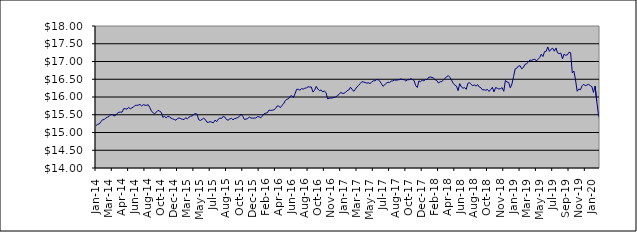
| Category | Series 0 |
|---|---|
| 2014-01-09 | 15.193 |
| 2014-01-17 | 15.231 |
| 2014-01-23 | 15.241 |
| 2014-01-31 | 15.301 |
| 2014-02-10 | 15.36 |
| 2014-02-14 | 15.362 |
| 2014-02-20 | 15.408 |
| 2014-02-28 | 15.432 |
| 2014-03-10 | 15.454 |
| 2014-03-14 | 15.502 |
| 2014-03-20 | 15.505 |
| 2014-03-26 | 15.466 |
| 2014-03-31 | 15.48 |
| 2014-04-09 | 15.541 |
| 2014-04-15 | 15.571 |
| 2014-04-24 | 15.573 |
| 2014-04-30 | 15.574 |
| 2014-05-08 | 15.673 |
| 2014-05-16 | 15.671 |
| 2014-05-22 | 15.656 |
| 2014-05-31 | 15.708 |
| 2014-06-09 | 15.667 |
| 2014-06-16 | 15.692 |
| 2014-06-20 | 15.717 |
| 2014-06-30 | 15.765 |
| 2014-07-09 | 15.765 |
| 2014-07-15 | 15.772 |
| 2014-07-22 | 15.79 |
| 2014-07-31 | 15.746 |
| 2014-08-11 | 15.785 |
| 2014-08-14 | 15.77 |
| 2014-08-21 | 15.765 |
| 2014-08-30 | 15.783 |
| 2014-09-08 | 15.703 |
| 2014-09-16 | 15.599 |
| 2014-09-23 | 15.56 |
| 2014-09-30 | 15.523 |
| 2014-10-09 | 15.576 |
| 2014-10-16 | 15.623 |
| 2014-10-23 | 15.601 |
| 2014-10-31 | 15.569 |
| 2014-11-10 | 15.429 |
| 2014-11-13 | 15.453 |
| 2014-11-20 | 15.416 |
| 2014-11-29 | 15.453 |
| 2014-12-10 | 15.441 |
| 2014-12-18 | 15.405 |
| 2014-12-23 | 15.384 |
| 2014-12-30 | 15.366 |
| 2015-01-08 | 15.346 |
| 2015-01-15 | 15.395 |
| 2015-01-30 | 15.412 |
| 2015-02-10 | 15.388 |
| 2015-02-16 | 15.373 |
| 2015-02-19 | 15.362 |
| 2015-02-28 | 15.417 |
| 2015-03-10 | 15.386 |
| 2015-03-13 | 15.43 |
| 2015-03-19 | 15.46 |
| 2015-03-27 | 15.467 |
| 2015-04-07 | 15.504 |
| 2015-04-16 | 15.55 |
| 2015-04-27 | 15.503 |
| 2015-05-08 | 15.359 |
| 2015-05-14 | 15.339 |
| 2015-05-21 | 15.37 |
| 2015-05-27 | 15.4 |
| 2015-06-03 | 15.368 |
| 2015-06-09 | 15.29 |
| 2015-06-15 | 15.288 |
| 2015-06-22 | 15.308 |
| 2015-06-26 | 15.289 |
| 2015-07-02 | 15.276 |
| 2015-07-09 | 15.349 |
| 2015-07-14 | 15.304 |
| 2015-07-23 | 15.379 |
| 2015-07-29 | 15.406 |
| 2015-08-06 | 15.396 |
| 2015-08-13 | 15.458 |
| 2015-08-20 | 15.434 |
| 2015-08-27 | 15.364 |
| 2015-09-03 | 15.348 |
| 2015-09-09 | 15.382 |
| 2015-09-15 | 15.398 |
| 2015-09-21 | 15.359 |
| 2015-09-28 | 15.39 |
| 2015-10-07 | 15.403 |
| 2015-10-13 | 15.423 |
| 2015-10-22 | 15.457 |
| 2015-10-28 | 15.522 |
| 2015-11-04 | 15.453 |
| 2015-11-13 | 15.367 |
| 2015-11-19 | 15.379 |
| 2015-11-27 | 15.39 |
| 2015-12-03 | 15.438 |
| 2015-12-10 | 15.408 |
| 2015-12-15 | 15.401 |
| 2015-12-23 | 15.407 |
| 2015-12-29 | 15.407 |
| 2016-01-07 | 15.448 |
| 2016-01-14 | 15.441 |
| 2016-01-21 | 15.414 |
| 2016-01-28 | 15.463 |
| 2016-02-04 | 15.526 |
| 2016-02-11 | 15.544 |
| 2016-02-18 | 15.553 |
| 2016-02-25 | 15.629 |
| 2016-03-03 | 15.622 |
| 2016-03-10 | 15.628 |
| 2016-03-16 | 15.637 |
| 2016-03-29 | 15.67 |
| 2016-04-07 | 15.744 |
| 2016-04-14 | 15.749 |
| 2016-04-28 | 15.7 |
| 2016-05-05 | 15.765 |
| 2016-05-12 | 15.805 |
| 2016-05-19 | 15.898 |
| 2016-05-30 | 15.934 |
| 2016-06-03 | 15.949 |
| 2016-06-09 | 16.018 |
| 2016-06-15 | 16.039 |
| 2016-06-23 | 15.985 |
| 2016-06-29 | 16.088 |
| 2016-07-11 | 16.216 |
| 2016-07-14 | 16.217 |
| 2016-07-21 | 16.191 |
| 2016-07-28 | 16.236 |
| 2016-08-04 | 16.22 |
| 2016-08-11 | 16.247 |
| 2016-08-16 | 16.257 |
| 2016-08-24 | 16.289 |
| 2016-08-30 | 16.281 |
| 2016-09-08 | 16.282 |
| 2016-09-15 | 16.139 |
| 2016-09-22 | 16.188 |
| 2016-09-29 | 16.298 |
| 2016-10-06 | 16.226 |
| 2016-10-13 | 16.178 |
| 2016-10-20 | 16.198 |
| 2016-10-28 | 16.143 |
| 2016-11-03 | 16.17 |
| 2016-11-10 | 16.128 |
| 2016-11-15 | 15.948 |
| 2016-11-23 | 15.965 |
| 2016-11-29 | 15.969 |
| 2016-12-07 | 15.974 |
| 2016-12-14 | 15.987 |
| 2016-12-21 | 15.998 |
| 2016-12-28 | 16.041 |
| 2017-01-05 | 16.071 |
| 2017-01-16 | 16.13 |
| 2017-01-23 | 16.104 |
| 2017-01-30 | 16.102 |
| 2017-02-06 | 16.131 |
| 2017-02-13 | 16.18 |
| 2017-02-20 | 16.197 |
| 2017-02-27 | 16.274 |
| 2017-03-06 | 16.219 |
| 2017-03-13 | 16.159 |
| 2017-03-20 | 16.218 |
| 2017-03-27 | 16.286 |
| 2017-03-30 | 16.326 |
| 2017-04-10 | 16.379 |
| 2017-04-18 | 16.431 |
| 2017-04-24 | 16.423 |
| 2017-04-28 | 16.408 |
| 2017-05-08 | 16.391 |
| 2017-05-15 | 16.4 |
| 2017-05-22 | 16.378 |
| 2017-05-30 | 16.419 |
| 2017-06-06 | 16.456 |
| 2017-06-12 | 16.457 |
| 2017-06-15 | 16.49 |
| 2017-06-20 | 16.485 |
| 2017-06-29 | 16.448 |
| 2017-07-04 | 16.374 |
| 2017-07-10 | 16.302 |
| 2017-07-14 | 16.341 |
| 2017-07-19 | 16.389 |
| 2017-07-24 | 16.417 |
| 2017-07-28 | 16.41 |
| 2017-08-03 | 16.45 |
| 2017-08-09 | 16.454 |
| 2017-08-14 | 16.475 |
| 2017-08-21 | 16.474 |
| 2017-08-24 | 16.48 |
| 2017-08-30 | 16.488 |
| 2017-09-07 | 16.512 |
| 2017-09-14 | 16.491 |
| 2017-09-20 | 16.487 |
| 2017-09-29 | 16.449 |
| 2017-10-05 | 16.484 |
| 2017-10-11 | 16.486 |
| 2017-10-16 | 16.52 |
| 2017-10-23 | 16.492 |
| 2017-10-30 | 16.466 |
| 2017-11-07 | 16.319 |
| 2017-11-15 | 16.268 |
| 2017-11-23 | 16.453 |
| 2017-11-29 | 16.434 |
| 2017-12-07 | 16.474 |
| 2017-12-13 | 16.455 |
| 2017-12-18 | 16.493 |
| 2017-12-28 | 16.494 |
| 2018-01-08 | 16.556 |
| 2018-01-17 | 16.562 |
| 2018-01-24 | 16.551 |
| 2018-01-30 | 16.531 |
| 2018-02-05 | 16.487 |
| 2018-02-13 | 16.458 |
| 2018-02-19 | 16.393 |
| 2018-02-27 | 16.431 |
| 2018-03-07 | 16.433 |
| 2018-03-14 | 16.482 |
| 2018-03-21 | 16.531 |
| 2018-03-29 | 16.568 |
| 2018-04-10 | 16.602 |
| 2018-04-16 | 16.552 |
| 2018-04-23 | 16.475 |
| 2018-04-27 | 16.386 |
| 2018-05-10 | 16.335 |
| 2018-05-15 | 16.307 |
| 2018-05-22 | 16.18 |
| 2018-05-30 | 16.376 |
| 2018-06-06 | 16.284 |
| 2018-06-13 | 16.249 |
| 2018-06-20 | 16.264 |
| 2018-06-29 | 16.217 |
| 2018-07-10 | 16.385 |
| 2018-07-16 | 16.405 |
| 2018-07-23 | 16.352 |
| 2018-07-30 | 16.32 |
| 2018-08-07 | 16.339 |
| 2018-08-13 | 16.308 |
| 2018-08-24 | 16.349 |
| 2018-08-30 | 16.281 |
| 2018-09-06 | 16.26 |
| 2018-09-13 | 16.199 |
| 2018-09-24 | 16.203 |
| 2018-09-28 | 16.193 |
| 2018-10-04 | 16.213 |
| 2018-10-10 | 16.157 |
| 2018-10-16 | 16.21 |
| 2018-10-23 | 16.274 |
| 2018-10-30 | 16.145 |
| 2018-11-07 | 16.267 |
| 2018-11-15 | 16.246 |
| 2018-11-21 | 16.223 |
| 2018-11-29 | 16.237 |
| 2018-12-07 | 16.262 |
| 2018-12-14 | 16.161 |
| 2018-12-21 | 16.465 |
| 2018-12-28 | 16.422 |
| 2019-01-08 | 16.412 |
| 2019-01-14 | 16.259 |
| 2019-01-21 | 16.366 |
| 2019-01-30 | 16.572 |
| 2019-02-11 | 16.793 |
| 2019-02-14 | 16.811 |
| 2019-02-21 | 16.874 |
| 2019-02-27 | 16.879 |
| 2019-03-07 | 16.795 |
| 2019-03-14 | 16.83 |
| 2019-03-21 | 16.919 |
| 2019-03-29 | 16.938 |
| 2019-04-04 | 16.98 |
| 2019-04-12 | 17.041 |
| 2019-04-18 | 17.032 |
| 2019-04-29 | 17.052 |
| 2019-05-08 | 17.068 |
| 2019-05-15 | 17.014 |
| 2019-05-23 | 17.063 |
| 2019-05-30 | 17.11 |
| 2019-06-10 | 17.206 |
| 2019-06-14 | 17.14 |
| 2019-06-21 | 17.275 |
| 2019-06-28 | 17.287 |
| 2019-07-04 | 17.41 |
| 2019-07-15 | 17.285 |
| 2019-07-22 | 17.347 |
| 2019-07-30 | 17.372 |
| 2019-08-06 | 17.291 |
| 2019-08-16 | 17.381 |
| 2019-08-22 | 17.245 |
| 2019-08-30 | 17.221 |
| 2019-09-09 | 17.236 |
| 2019-09-16 | 17.076 |
| 2019-09-20 | 17.208 |
| 2019-09-27 | 17.173 |
| 2019-10-03 | 17.189 |
| 2019-10-09 | 17.262 |
| 2019-10-15 | 17.245 |
| 2019-10-30 | 16.679 |
| 2019-11-07 | 16.73 |
| 2019-11-14 | 16.481 |
| 2019-11-21 | 16.162 |
| 2019-11-29 | 16.224 |
| 2019-12-05 | 16.204 |
| 2019-12-11 | 16.316 |
| 2019-12-17 | 16.363 |
| 2019-12-23 | 16.313 |
| 2019-12-30 | 16.339 |
| 2020-01-07 | 16.356 |
| 2020-01-15 | 16.322 |
| 2020-01-22 | 16.294 |
| 2020-01-30 | 16.131 |
| 2020-02-06 | 16.307 |
| 2020-02-14 | 15.886 |
| 2020-02-20 | 15.516 |
| 2020-02-28 | 15.347 |